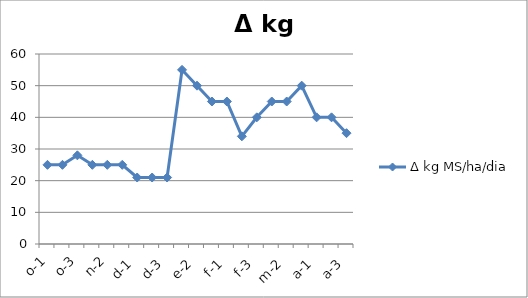
| Category | Δ kg MS/ha/dia |
|---|---|
| o-1 | 25 |
| o-2 | 25 |
| o-3 | 28 |
| n-1 | 25 |
| n-2 | 25 |
| n-3 | 25 |
| d-1 | 21 |
| d-2 | 21 |
| d-3 | 21 |
| e-1 | 55 |
| e-2 | 50 |
| e-3 | 45 |
| f-1 | 45 |
| f-2 | 34 |
| f-3 | 40 |
| m-1 | 45 |
| m-2 | 45 |
| m-3 | 50 |
| a-1 | 40 |
| a-2 | 40 |
| a-3 | 35 |